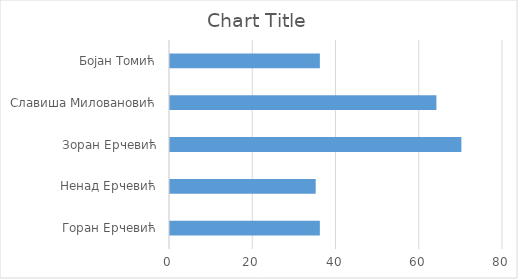
| Category | Series 0 |
|---|---|
| Горан Ерчевић | 36 |
| Ненад Ерчевић | 35 |
| Зоран Ерчевић | 70 |
| Славиша Миловановић | 64 |
| Бојан Томић | 36 |